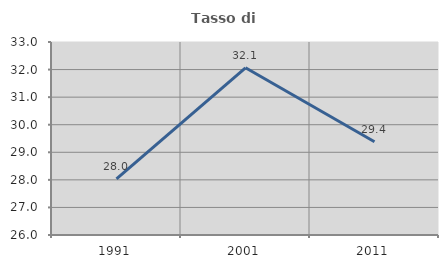
| Category | Tasso di occupazione   |
|---|---|
| 1991.0 | 28.033 |
| 2001.0 | 32.064 |
| 2011.0 | 29.383 |